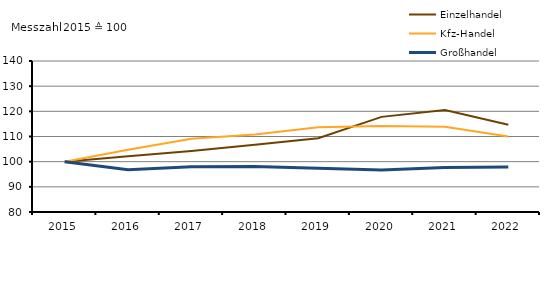
| Category | Einzelhandel | Kfz-Handel | Großhandel |
|---|---|---|---|
| 2015.0 | 100 | 100 | 100 |
| 2016.0 | 102.2 | 104.7 | 96.8 |
| 2017.0 | 104.2 | 109.1 | 98 |
| 2018.0 | 106.7 | 110.8 | 98.1 |
| 2019.0 | 109.3 | 113.7 | 97.4 |
| 2020.0 | 117.8 | 114.2 | 96.7 |
| 2021.0 | 120.5 | 113.9 | 97.7 |
| 2022.0 | 114.7 | 110 | 97.9 |